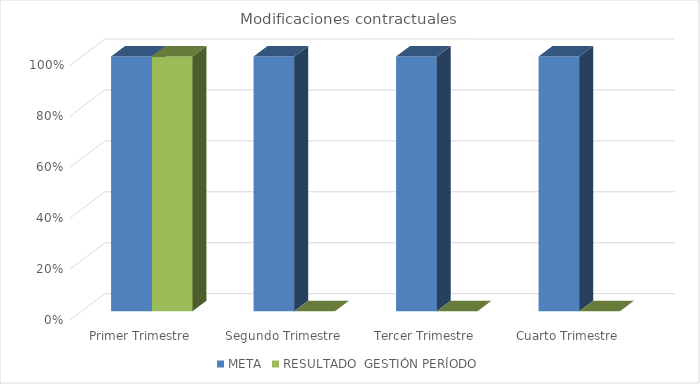
| Category | META | RESULTADO  GESTIÓN PERÍODO |
|---|---|---|
| Primer Trimestre | 1 | 1 |
| Segundo Trimestre | 1 | 0 |
| Tercer Trimestre | 1 | 0 |
| Cuarto Trimestre | 1 | 0 |